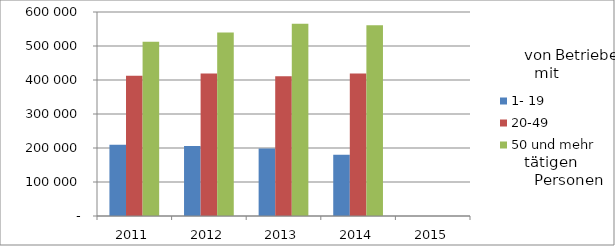
| Category | 1- 19 | 20-49 | 50 und mehr |
|---|---|---|---|
| 2011.0 | 209303.888 | 412784.329 | 512321.038 |
| 2012.0 | 205869.761 | 419212.589 | 539878.342 |
| 2013.0 | 198520.981 | 411220.539 | 565167.223 |
| 2014.0 | 180326.18 | 418921.142 | 560768.499 |
| 2015.0 | 0 | 0 | 0 |